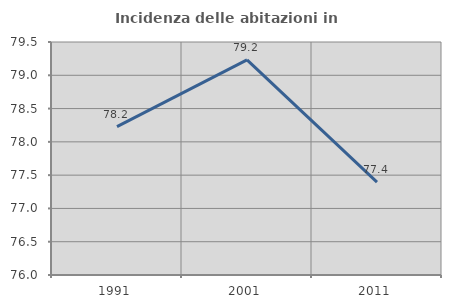
| Category | Incidenza delle abitazioni in proprietà  |
|---|---|
| 1991.0 | 78.229 |
| 2001.0 | 79.232 |
| 2011.0 | 77.396 |